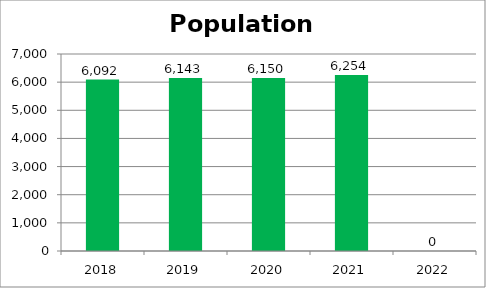
| Category | Population Served |
|---|---|
| 2018.0 | 6092 |
| 2019.0 | 6143 |
| 2020.0 | 6150 |
| 2021.0 | 6254 |
| 2022.0 | 0 |